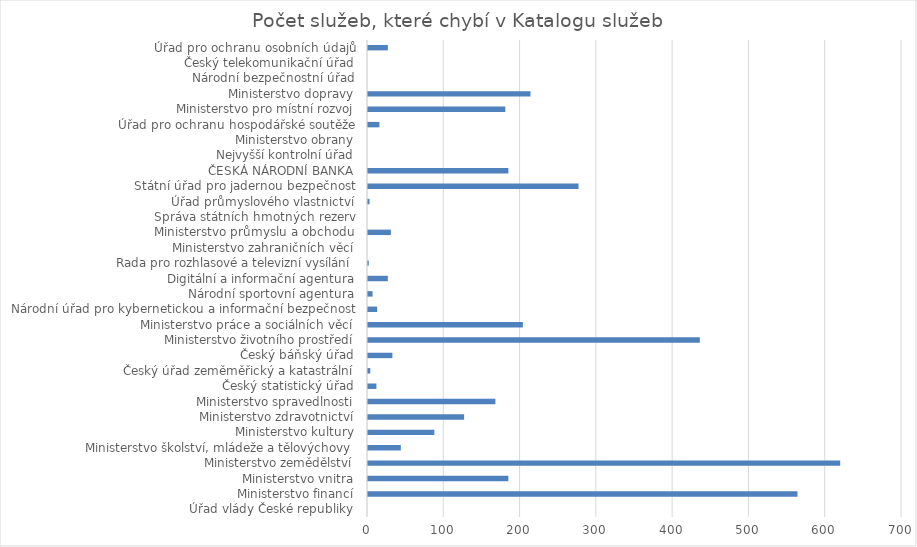
| Category | Počet služeb, které chybí v Katalogu služeb |
|---|---|
| Úřad vlády České republiky | 0 |
| Ministerstvo financí | 563 |
| Ministerstvo vnitra | 184 |
| Ministerstvo zemědělství | 619 |
| Ministerstvo školství, mládeže a tělovýchovy | 43 |
| Ministerstvo kultury | 87 |
| Ministerstvo zdravotnictví | 126 |
| Ministerstvo spravedlnosti | 167 |
| Český statistický úřad | 11 |
| Český úřad zeměměřický a katastrální | 3 |
| Český báňský úřad | 32 |
| Ministerstvo životního prostředí | 435 |
| Ministerstvo práce a sociálních věcí | 203 |
| Národní úřad pro kybernetickou a informační bezpečnost | 12 |
| Národní sportovní agentura | 6 |
| Digitální a informační agentura | 26 |
| Rada pro rozhlasové a televizní vysílání | 1 |
| Ministerstvo zahraničních věcí | 0 |
| Ministerstvo průmyslu a obchodu | 30 |
| Správa státních hmotných rezerv | 0 |
| Úřad průmyslového vlastnictví | 2 |
| Státní úřad pro jadernou bezpečnost | 276 |
| ČESKÁ NÁRODNÍ BANKA | 184 |
| Nejvyšší kontrolní úřad | 0 |
| Ministerstvo obrany | 0 |
| Úřad pro ochranu hospodářské soutěže | 15 |
| Ministerstvo pro místní rozvoj | 180 |
| Ministerstvo dopravy | 213 |
| Národní bezpečnostní úřad | 0 |
| Český telekomunikační úřad | 0 |
| Úřad pro ochranu osobních údajů | 26 |